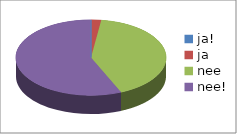
| Category | Series 0 | Series 1 |
|---|---|---|
| ja! | 0 | 0 |
| ja | 1 | 0.022 |
| nee | 19 | 0.413 |
| nee! | 26 | 0.565 |